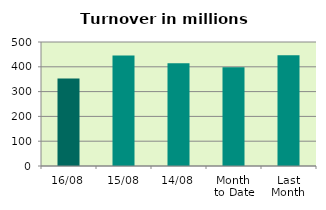
| Category | Series 0 |
|---|---|
| 16/08 | 352.73 |
| 15/08 | 445.296 |
| 14/08 | 414.29 |
| Month 
to Date | 398.634 |
| Last
Month | 446.279 |